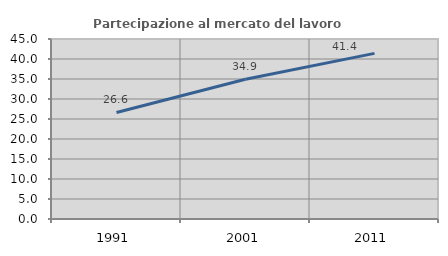
| Category | Partecipazione al mercato del lavoro  femminile |
|---|---|
| 1991.0 | 26.632 |
| 2001.0 | 34.934 |
| 2011.0 | 41.406 |